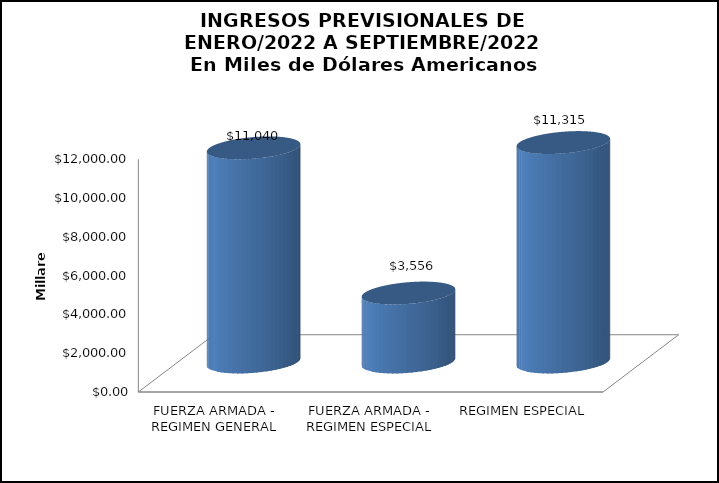
| Category | MONTO ANUAL |
|---|---|
| FUERZA ARMADA - REGIMEN GENERAL | 11040018.19 |
| FUERZA ARMADA - REGIMEN ESPECIAL | 3556002.25 |
| REGIMEN ESPECIAL | 11314742.64 |